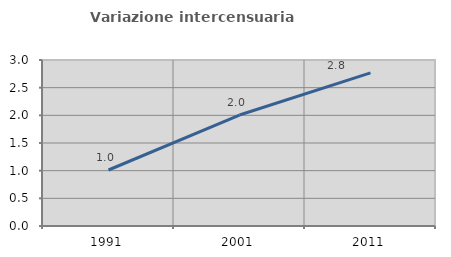
| Category | Variazione intercensuaria annua |
|---|---|
| 1991.0 | 1.012 |
| 2001.0 | 2.006 |
| 2011.0 | 2.767 |